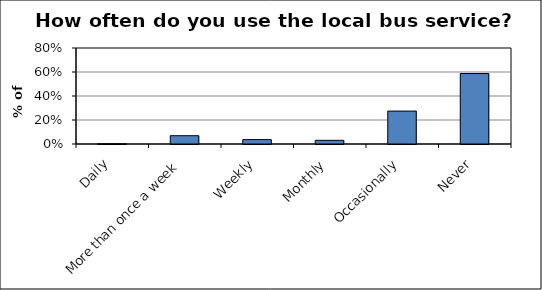
| Category | Series 0 |
|---|---|
| Daily | 0.002 |
| More than once a week | 0.069 |
| Weekly | 0.036 |
| Monthly | 0.031 |
| Occasionally | 0.274 |
| Never | 0.587 |